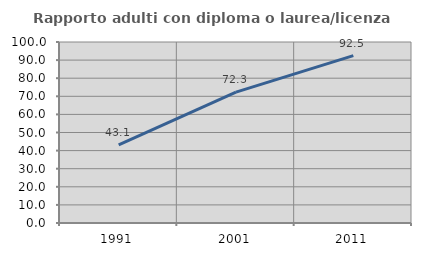
| Category | Rapporto adulti con diploma o laurea/licenza media  |
|---|---|
| 1991.0 | 43.106 |
| 2001.0 | 72.325 |
| 2011.0 | 92.466 |